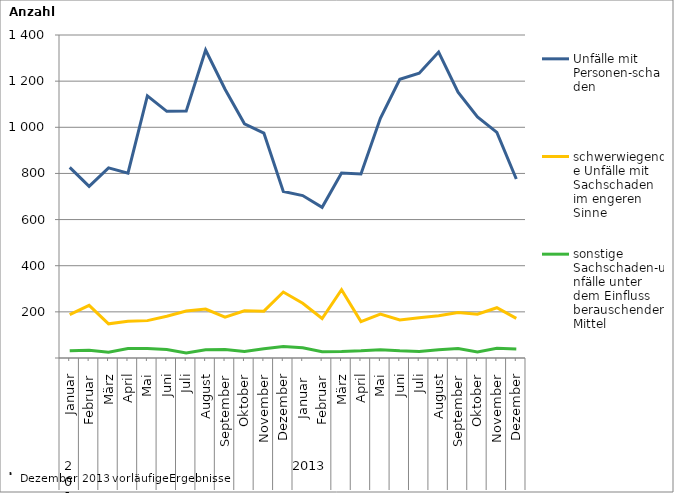
| Category | Unfälle mit Personen-schaden | schwerwiegende Unfälle mit Sachschaden   im engeren Sinne | sonstige Sachschaden-unfälle unter dem Einfluss berauschender Mittel |
|---|---|---|---|
| 0 | 826 | 188 | 31 |
| 1 | 744 | 228 | 34 |
| 2 | 824 | 148 | 25 |
| 3 | 801 | 159 | 41 |
| 4 | 1136 | 162 | 41 |
| 5 | 1069 | 181 | 37 |
| 6 | 1070 | 204 | 22 |
| 7 | 1335 | 212 | 36 |
| 8 | 1165 | 177 | 37 |
| 9 | 1015 | 205 | 28 |
| 10 | 975 | 203 | 40 |
| 11 | 722 | 286 | 50 |
| 12 | 704 | 237 | 44 |
| 13 | 653 | 171 | 27 |
| 14 | 802 | 296 | 28 |
| 15 | 798 | 158 | 31 |
| 16 | 1039 | 190 | 36 |
| 17 | 1208 | 165 | 31 |
| 18 | 1234 | 174 | 28 |
| 19 | 1326 | 183 | 36 |
| 20 | 1152 | 197 | 41 |
| 21 | 1045 | 190 | 26 |
| 22 | 978 | 218 | 42 |
| 23 | 776 | 172 | 39 |